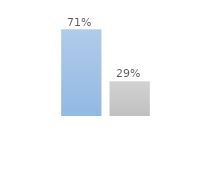
| Category | Series 0 | Series 2 |
|---|---|---|
| 0 | 0.712 | 0.288 |